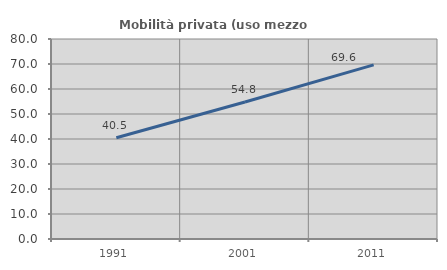
| Category | Mobilità privata (uso mezzo privato) |
|---|---|
| 1991.0 | 40.485 |
| 2001.0 | 54.819 |
| 2011.0 | 69.641 |